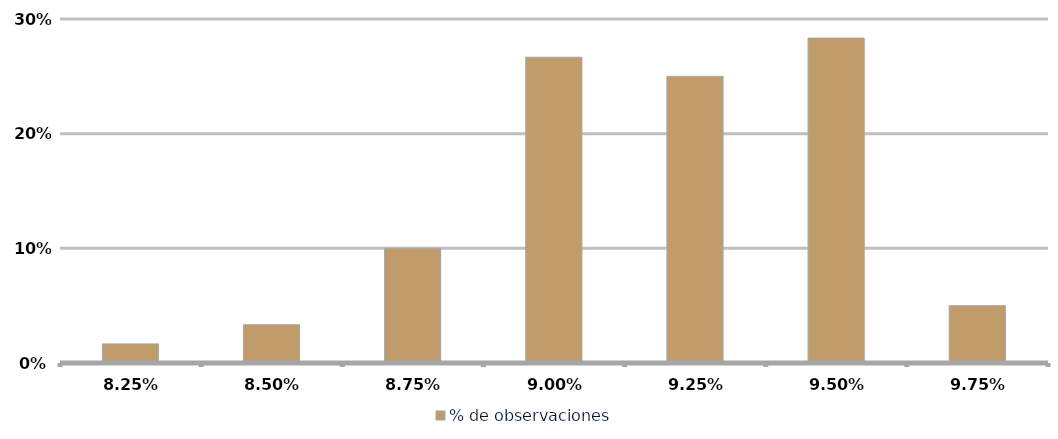
| Category | % de observaciones  |
|---|---|
| 0.08249999999999999 | 0.017 |
| 0.08499999999999999 | 0.033 |
| 0.0875 | 0.1 |
| 0.09 | 0.267 |
| 0.0925 | 0.25 |
| 0.095 | 0.283 |
| 0.0975 | 0.05 |